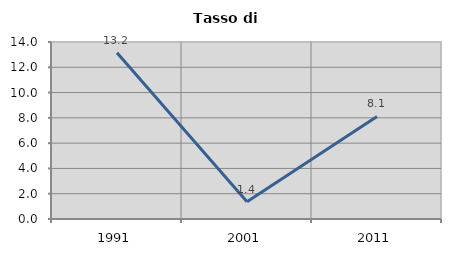
| Category | Tasso di disoccupazione   |
|---|---|
| 1991.0 | 13.158 |
| 2001.0 | 1.37 |
| 2011.0 | 8.108 |